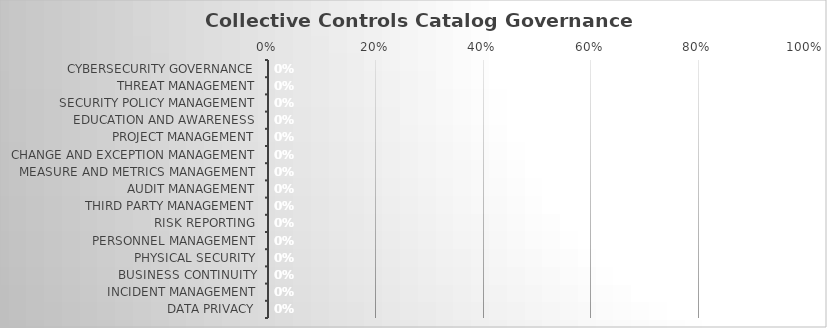
| Category | Score: |
|---|---|
| Cybersecurity Governance | 0 |
| Threat Management | 0 |
| Security Policy Management | 0 |
| Education and Awareness | 0 |
| Project Management | 0 |
| Change and Exception Management | 0 |
| Measure and Metrics Management | 0 |
| Audit Management | 0 |
| Third Party Management | 0 |
| Risk Reporting | 0 |
| Personnel Management | 0 |
| Physical Security | 0 |
| Business Continuity | 0 |
| Incident Management | 0 |
| Data Privacy | 0 |